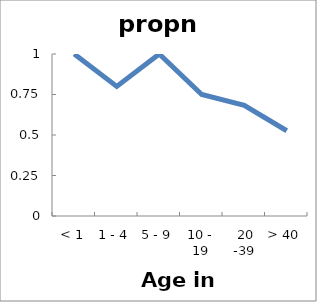
| Category | propn positive |
|---|---|
| < 1 | 1 |
| 1 - 4 | 0.8 |
| 5 - 9 | 1 |
| 10 - 19 | 0.75 |
|  20 -39 | 0.683 |
| > 40 | 0.526 |